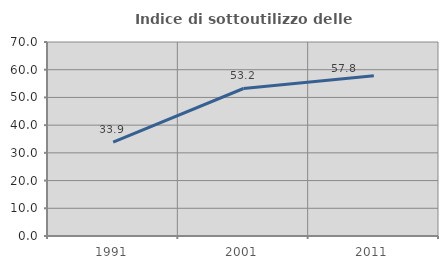
| Category | Indice di sottoutilizzo delle abitazioni  |
|---|---|
| 1991.0 | 33.887 |
| 2001.0 | 53.226 |
| 2011.0 | 57.784 |